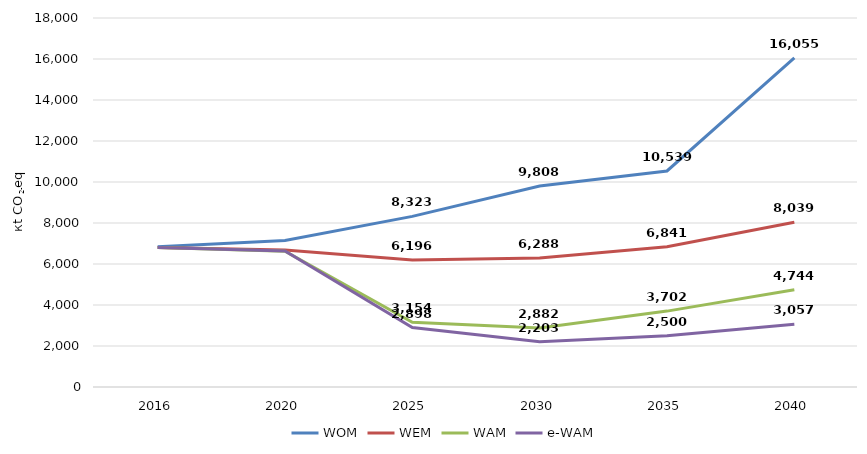
| Category | WOM | WEM | WAM | e-WAM |
|---|---|---|---|---|
| 2016.0 | 6838 | 6805 | 6809 | 6808 |
| 2020.0 | 7151 | 6684 | 6626 | 6639 |
| 2025.0 | 8323 | 6196 | 3154 | 2898 |
| 2030.0 | 9808 | 6288 | 2882 | 2203 |
| 2035.0 | 10539 | 6841 | 3702 | 2500 |
| 2040.0 | 16055 | 8039 | 4744 | 3057 |